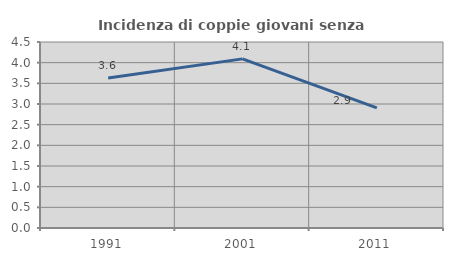
| Category | Incidenza di coppie giovani senza figli |
|---|---|
| 1991.0 | 3.632 |
| 2001.0 | 4.092 |
| 2011.0 | 2.906 |